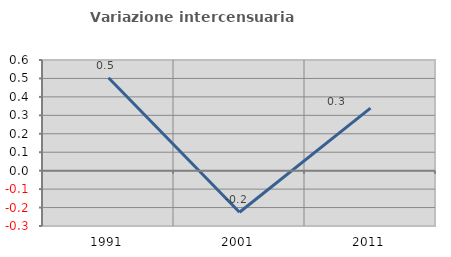
| Category | Variazione intercensuaria annua |
|---|---|
| 1991.0 | 0.504 |
| 2001.0 | -0.225 |
| 2011.0 | 0.339 |